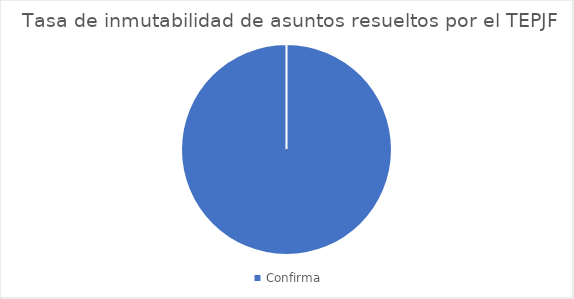
| Category | Tasa de inmutabilidad de asuntos resueltos por el TEPJF |
|---|---|
| Confirma | 9 |